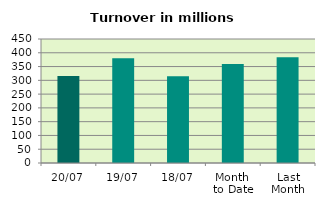
| Category | Series 0 |
|---|---|
| 20/07 | 315.926 |
| 19/07 | 380.361 |
| 18/07 | 315.038 |
| Month 
to Date | 359.197 |
| Last
Month | 384.158 |